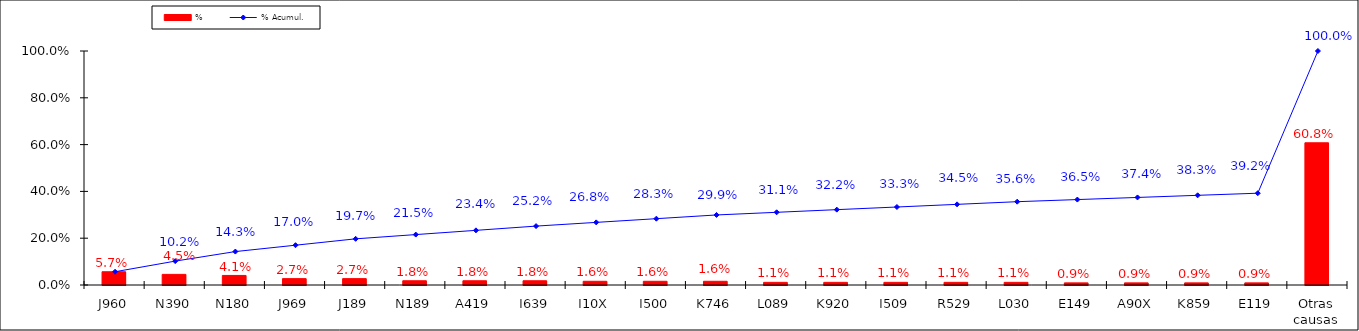
| Category | % |
|---|---|
| J960 | 0.057 |
| N390 | 0.045 |
| N180 | 0.041 |
| J969 | 0.027 |
| J189 | 0.027 |
| N189 | 0.018 |
| A419 | 0.018 |
| I639 | 0.018 |
| I10X | 0.016 |
| I500 | 0.016 |
| K746 | 0.016 |
| L089 | 0.011 |
| K920 | 0.011 |
| I509 | 0.011 |
| R529 | 0.011 |
| L030 | 0.011 |
| E149 | 0.009 |
| A90X | 0.009 |
| K859 | 0.009 |
| E119 | 0.009 |
| Otras causas | 0.608 |